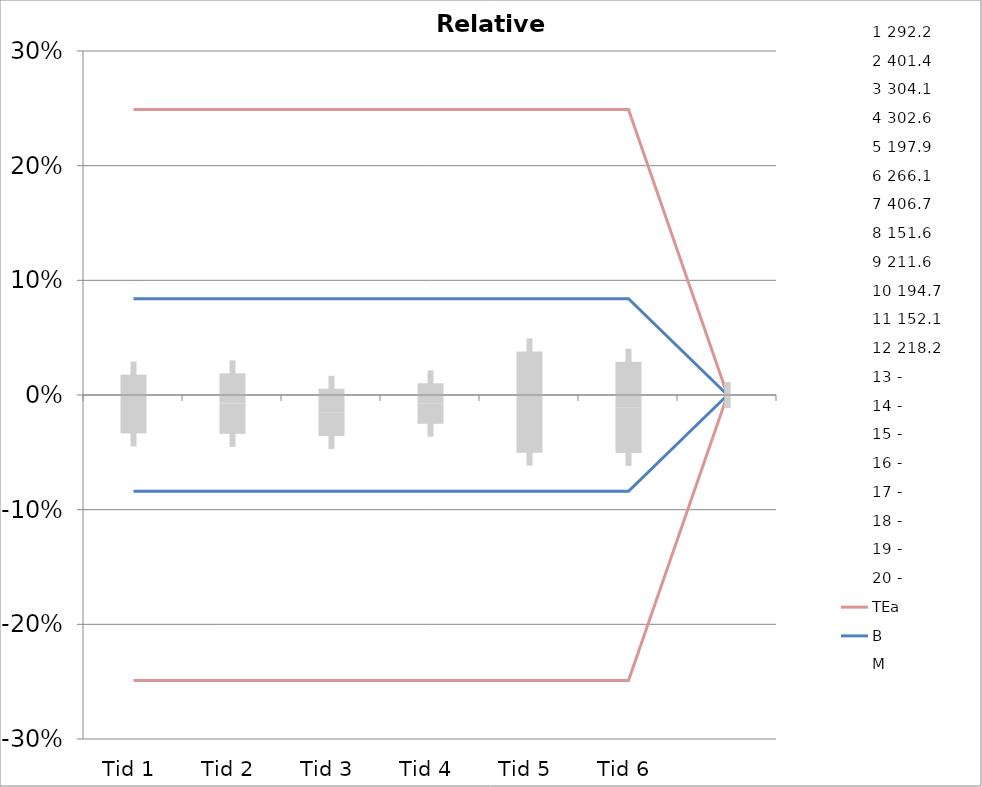
| Category | 1 | 2 | 3 | 4 | 5 | 6 | 7 | 8 | 9 | 10 | 11 | 12 | 13 | 14 | 15 | 16 | 17 | 18 | 19 | 20 | TEa | B | -B | -TEa | M |
|---|---|---|---|---|---|---|---|---|---|---|---|---|---|---|---|---|---|---|---|---|---|---|---|---|---|
| Tid 1 | -0.019 | 0.061 | 0.006 | 0.029 | -0.039 | -0.054 | -0.049 | 0.01 | -0.055 | -0.017 | 0.054 | -0.021 | 0 | 0 | 0 | 0 | 0 | 0 | 0 | 0 | 0.249 | 0.084 | -0.084 | -0.249 | -0.008 |
| Tid 2 | 0.015 | 0.013 | -0.011 | 0.004 | -0.048 | -0.055 | -0.009 | 0.003 | -0.057 | -0.007 | 0.097 | -0.033 | 0 | 0 | 0 | 0 | 0 | 0 | 0 | 0 | 0.249 | 0.084 | -0.084 | -0.249 | -0.007 |
| Tid 3 | -0.056 | 0.025 | -0.042 | 0.009 | -0.052 | -0.048 | -0.015 | 0.002 | -0.034 | -0.011 | 0.045 | -0.004 | 0 | 0 | 0 | 0 | 0 | 0 | 0 | 0 | 0.249 | 0.084 | -0.084 | -0.249 | -0.015 |
| Tid 4 | -0.014 | 0.012 | -0.021 | 0 | -0.05 | -0.035 | 0.006 | 0.029 | -0.05 | -0.001 | 0.036 | -0.002 | 0 | 0 | 0 | 0 | 0 | 0 | 0 | 0 | 0.249 | 0.084 | -0.084 | -0.249 | -0.007 |
| Tid 5 | -0.059 | 0.057 | -0.035 | 0.052 | -0.028 | -0.046 | 0 | 0 | 0 | 0.016 | 0 | 0 | 0 | 0 | 0 | 0 | 0 | 0 | 0 | 0 | 0.249 | 0.084 | -0.084 | -0.249 | -0.006 |
| Tid 6 | 0 | 0 | 0 | 0 | 0 | 0 | 0.02 | 0.001 | -0.059 | -0.004 | 0.032 | -0.055 | 0 | 0 | 0 | 0 | 0 | 0 | 0 | 0 | 0.249 | 0.084 | -0.084 | -0.249 | -0.011 |